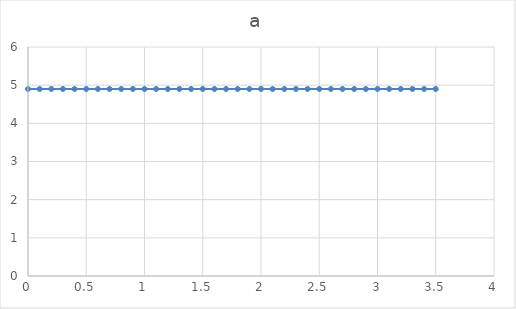
| Category | a |
|---|---|
| 0.0 | 4.9 |
| 0.1 | 4.9 |
| 0.2 | 4.9 |
| 0.3 | 4.9 |
| 0.4 | 4.9 |
| 0.5 | 4.9 |
| 0.6 | 4.9 |
| 0.7 | 4.9 |
| 0.8 | 4.9 |
| 0.9 | 4.9 |
| 1.0 | 4.9 |
| 1.1 | 4.9 |
| 1.2 | 4.9 |
| 1.3 | 4.9 |
| 1.4 | 4.9 |
| 1.5 | 4.9 |
| 1.6 | 4.9 |
| 1.7 | 4.9 |
| 1.8 | 4.9 |
| 1.9 | 4.9 |
| 2.0 | 4.9 |
| 2.1 | 4.9 |
| 2.2 | 4.9 |
| 2.3 | 4.9 |
| 2.4 | 4.9 |
| 2.5 | 4.9 |
| 2.6 | 4.9 |
| 2.7 | 4.9 |
| 2.8 | 4.9 |
| 2.9 | 4.9 |
| 3.0 | 4.9 |
| 3.1 | 4.9 |
| 3.2 | 4.9 |
| 3.3 | 4.9 |
| 3.4 | 4.9 |
| 3.5 | 4.9 |